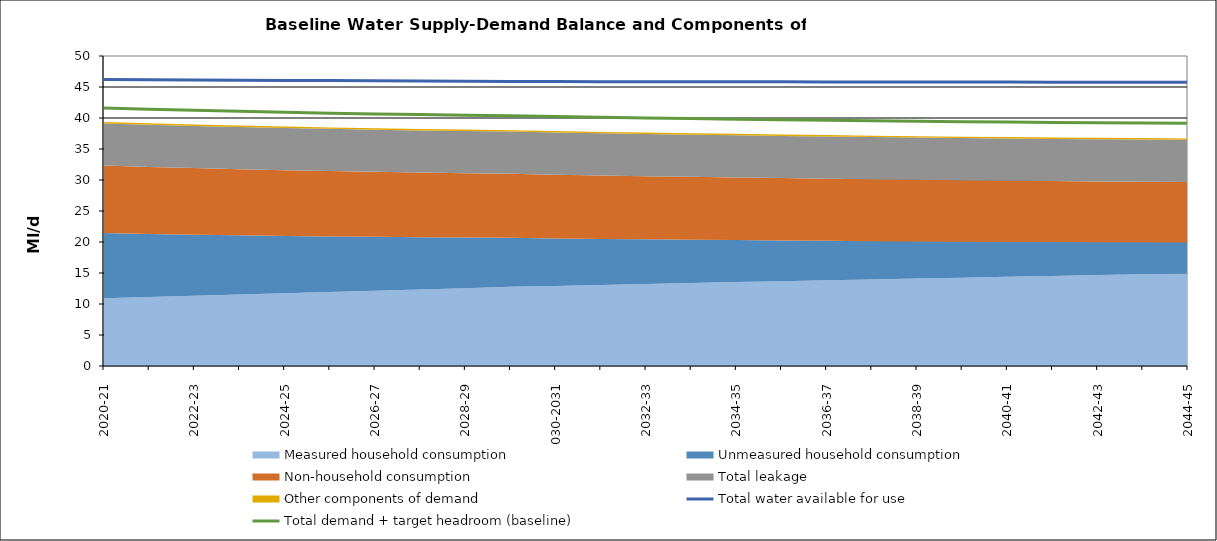
| Category | Total water available for use | Total demand + target headroom (baseline) |
|---|---|---|
| 0 | 46.199 | 41.625 |
| 1 | 46.166 | 41.421 |
| 2 | 46.132 | 41.237 |
| 3 | 46.099 | 41.073 |
| 4 | 46.066 | 40.923 |
| 5 | 46.033 | 40.785 |
| 6 | 45.999 | 40.662 |
| 7 | 45.966 | 40.552 |
| 8 | 45.933 | 40.456 |
| 9 | 45.899 | 40.374 |
| 10 | 45.874 | 40.234 |
| 11 | 45.866 | 40.106 |
| 12 | 45.858 | 40.003 |
| 13 | 45.849 | 39.907 |
| 14 | 45.841 | 39.818 |
| 15 | 45.832 | 39.721 |
| 16 | 45.824 | 39.63 |
| 17 | 45.816 | 39.547 |
| 18 | 45.808 | 39.47 |
| 19 | 45.799 | 39.399 |
| 20 | 45.791 | 39.339 |
| 21 | 45.783 | 39.284 |
| 22 | 45.774 | 39.24 |
| 23 | 45.766 | 39.194 |
| 24 | 45.758 | 39.153 |